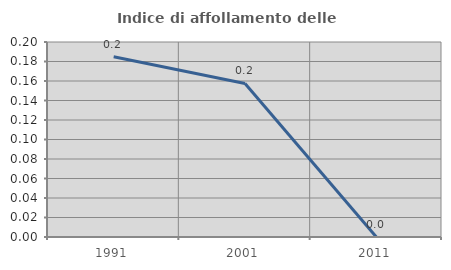
| Category | Indice di affollamento delle abitazioni  |
|---|---|
| 1991.0 | 0.185 |
| 2001.0 | 0.157 |
| 2011.0 | 0 |